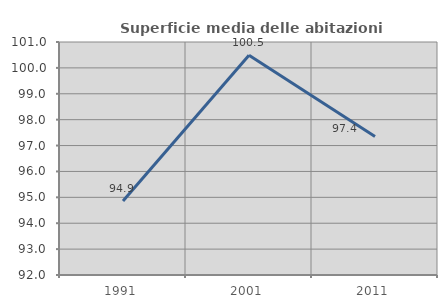
| Category | Superficie media delle abitazioni occupate |
|---|---|
| 1991.0 | 94.856 |
| 2001.0 | 100.491 |
| 2011.0 | 97.35 |